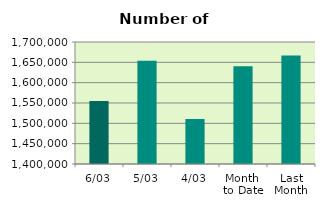
| Category | Series 0 |
|---|---|
| 6/03 | 1554646 |
| 5/03 | 1653910 |
| 4/03 | 1510694 |
| Month 
to Date | 1640215 |
| Last
Month | 1666801.1 |